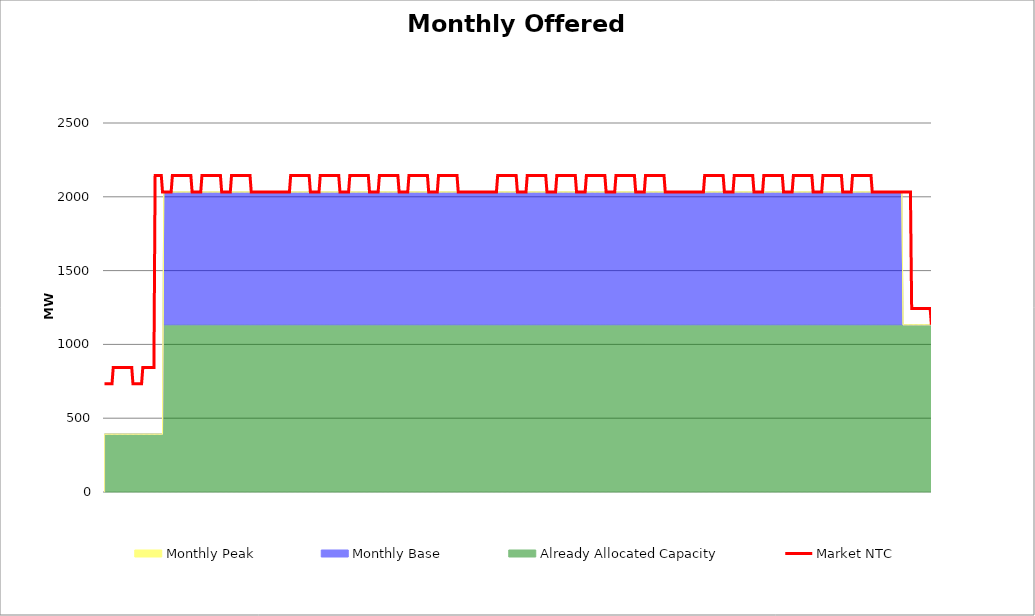
| Category | Market NTC |
|---|---|
| 0 | 733 |
| 1 | 733 |
| 2 | 733 |
| 3 | 733 |
| 4 | 733 |
| 5 | 733 |
| 6 | 733 |
| 7 | 844 |
| 8 | 844 |
| 9 | 844 |
| 10 | 844 |
| 11 | 844 |
| 12 | 844 |
| 13 | 844 |
| 14 | 844 |
| 15 | 844 |
| 16 | 844 |
| 17 | 844 |
| 18 | 844 |
| 19 | 844 |
| 20 | 844 |
| 21 | 844 |
| 22 | 844 |
| 23 | 733 |
| 24 | 733 |
| 25 | 733 |
| 26 | 733 |
| 27 | 733 |
| 28 | 733 |
| 29 | 733 |
| 30 | 733 |
| 31 | 844 |
| 32 | 844 |
| 33 | 844 |
| 34 | 844 |
| 35 | 844 |
| 36 | 844 |
| 37 | 844 |
| 38 | 844 |
| 39 | 844 |
| 40 | 844 |
| 41 | 2144 |
| 42 | 2144 |
| 43 | 2144 |
| 44 | 2144 |
| 45 | 2144 |
| 46 | 2144 |
| 47 | 2033 |
| 48 | 2033 |
| 49 | 2033 |
| 50 | 2033 |
| 51 | 2033 |
| 52 | 2033 |
| 53 | 2033 |
| 54 | 2033 |
| 55 | 2144 |
| 56 | 2144 |
| 57 | 2144 |
| 58 | 2144 |
| 59 | 2144 |
| 60 | 2144 |
| 61 | 2144 |
| 62 | 2144 |
| 63 | 2144 |
| 64 | 2144 |
| 65 | 2144 |
| 66 | 2144 |
| 67 | 2144 |
| 68 | 2144 |
| 69 | 2144 |
| 70 | 2144 |
| 71 | 2033 |
| 72 | 2033 |
| 73 | 2033 |
| 74 | 2033 |
| 75 | 2033 |
| 76 | 2033 |
| 77 | 2033 |
| 78 | 2033 |
| 79 | 2144 |
| 80 | 2144 |
| 81 | 2144 |
| 82 | 2144 |
| 83 | 2144 |
| 84 | 2144 |
| 85 | 2144 |
| 86 | 2144 |
| 87 | 2144 |
| 88 | 2144 |
| 89 | 2144 |
| 90 | 2144 |
| 91 | 2144 |
| 92 | 2144 |
| 93 | 2144 |
| 94 | 2144 |
| 95 | 2033 |
| 96 | 2033 |
| 97 | 2033 |
| 98 | 2033 |
| 99 | 2033 |
| 100 | 2033 |
| 101 | 2033 |
| 102 | 2033 |
| 103 | 2144 |
| 104 | 2144 |
| 105 | 2144 |
| 106 | 2144 |
| 107 | 2144 |
| 108 | 2144 |
| 109 | 2144 |
| 110 | 2144 |
| 111 | 2144 |
| 112 | 2144 |
| 113 | 2144 |
| 114 | 2144 |
| 115 | 2144 |
| 116 | 2144 |
| 117 | 2144 |
| 118 | 2144 |
| 119 | 2033 |
| 120 | 2033 |
| 121 | 2033 |
| 122 | 2033 |
| 123 | 2033 |
| 124 | 2033 |
| 125 | 2033 |
| 126 | 2033 |
| 127 | 2033 |
| 128 | 2033 |
| 129 | 2033 |
| 130 | 2033 |
| 131 | 2033 |
| 132 | 2033 |
| 133 | 2033 |
| 134 | 2033 |
| 135 | 2033 |
| 136 | 2033 |
| 137 | 2033 |
| 138 | 2033 |
| 139 | 2033 |
| 140 | 2033 |
| 141 | 2033 |
| 142 | 2033 |
| 143 | 2033 |
| 144 | 2033 |
| 145 | 2033 |
| 146 | 2033 |
| 147 | 2033 |
| 148 | 2033 |
| 149 | 2033 |
| 150 | 2033 |
| 151 | 2144 |
| 152 | 2144 |
| 153 | 2144 |
| 154 | 2144 |
| 155 | 2144 |
| 156 | 2144 |
| 157 | 2144 |
| 158 | 2144 |
| 159 | 2144 |
| 160 | 2144 |
| 161 | 2144 |
| 162 | 2144 |
| 163 | 2144 |
| 164 | 2144 |
| 165 | 2144 |
| 166 | 2144 |
| 167 | 2033 |
| 168 | 2033 |
| 169 | 2033 |
| 170 | 2033 |
| 171 | 2033 |
| 172 | 2033 |
| 173 | 2033 |
| 174 | 2033 |
| 175 | 2144 |
| 176 | 2144 |
| 177 | 2144 |
| 178 | 2144 |
| 179 | 2144 |
| 180 | 2144 |
| 181 | 2144 |
| 182 | 2144 |
| 183 | 2144 |
| 184 | 2144 |
| 185 | 2144 |
| 186 | 2144 |
| 187 | 2144 |
| 188 | 2144 |
| 189 | 2144 |
| 190 | 2144 |
| 191 | 2033 |
| 192 | 2033 |
| 193 | 2033 |
| 194 | 2033 |
| 195 | 2033 |
| 196 | 2033 |
| 197 | 2033 |
| 198 | 2033 |
| 199 | 2144 |
| 200 | 2144 |
| 201 | 2144 |
| 202 | 2144 |
| 203 | 2144 |
| 204 | 2144 |
| 205 | 2144 |
| 206 | 2144 |
| 207 | 2144 |
| 208 | 2144 |
| 209 | 2144 |
| 210 | 2144 |
| 211 | 2144 |
| 212 | 2144 |
| 213 | 2144 |
| 214 | 2144 |
| 215 | 2033 |
| 216 | 2033 |
| 217 | 2033 |
| 218 | 2033 |
| 219 | 2033 |
| 220 | 2033 |
| 221 | 2033 |
| 222 | 2033 |
| 223 | 2144 |
| 224 | 2144 |
| 225 | 2144 |
| 226 | 2144 |
| 227 | 2144 |
| 228 | 2144 |
| 229 | 2144 |
| 230 | 2144 |
| 231 | 2144 |
| 232 | 2144 |
| 233 | 2144 |
| 234 | 2144 |
| 235 | 2144 |
| 236 | 2144 |
| 237 | 2144 |
| 238 | 2144 |
| 239 | 2033 |
| 240 | 2033 |
| 241 | 2033 |
| 242 | 2033 |
| 243 | 2033 |
| 244 | 2033 |
| 245 | 2033 |
| 246 | 2033 |
| 247 | 2144 |
| 248 | 2144 |
| 249 | 2144 |
| 250 | 2144 |
| 251 | 2144 |
| 252 | 2144 |
| 253 | 2144 |
| 254 | 2144 |
| 255 | 2144 |
| 256 | 2144 |
| 257 | 2144 |
| 258 | 2144 |
| 259 | 2144 |
| 260 | 2144 |
| 261 | 2144 |
| 262 | 2144 |
| 263 | 2033 |
| 264 | 2033 |
| 265 | 2033 |
| 266 | 2033 |
| 267 | 2033 |
| 268 | 2033 |
| 269 | 2033 |
| 270 | 2033 |
| 271 | 2144 |
| 272 | 2144 |
| 273 | 2144 |
| 274 | 2144 |
| 275 | 2144 |
| 276 | 2144 |
| 277 | 2144 |
| 278 | 2144 |
| 279 | 2144 |
| 280 | 2144 |
| 281 | 2144 |
| 282 | 2144 |
| 283 | 2144 |
| 284 | 2144 |
| 285 | 2144 |
| 286 | 2144 |
| 287 | 2033 |
| 288 | 2033 |
| 289 | 2033 |
| 290 | 2033 |
| 291 | 2033 |
| 292 | 2033 |
| 293 | 2033 |
| 294 | 2033 |
| 295 | 2033 |
| 296 | 2033 |
| 297 | 2033 |
| 298 | 2033 |
| 299 | 2033 |
| 300 | 2033 |
| 301 | 2033 |
| 302 | 2033 |
| 303 | 2033 |
| 304 | 2033 |
| 305 | 2033 |
| 306 | 2033 |
| 307 | 2033 |
| 308 | 2033 |
| 309 | 2033 |
| 310 | 2033 |
| 311 | 2033 |
| 312 | 2033 |
| 313 | 2033 |
| 314 | 2033 |
| 315 | 2033 |
| 316 | 2033 |
| 317 | 2033 |
| 318 | 2033 |
| 319 | 2144 |
| 320 | 2144 |
| 321 | 2144 |
| 322 | 2144 |
| 323 | 2144 |
| 324 | 2144 |
| 325 | 2144 |
| 326 | 2144 |
| 327 | 2144 |
| 328 | 2144 |
| 329 | 2144 |
| 330 | 2144 |
| 331 | 2144 |
| 332 | 2144 |
| 333 | 2144 |
| 334 | 2144 |
| 335 | 2033 |
| 336 | 2033 |
| 337 | 2033 |
| 338 | 2033 |
| 339 | 2033 |
| 340 | 2033 |
| 341 | 2033 |
| 342 | 2033 |
| 343 | 2144 |
| 344 | 2144 |
| 345 | 2144 |
| 346 | 2144 |
| 347 | 2144 |
| 348 | 2144 |
| 349 | 2144 |
| 350 | 2144 |
| 351 | 2144 |
| 352 | 2144 |
| 353 | 2144 |
| 354 | 2144 |
| 355 | 2144 |
| 356 | 2144 |
| 357 | 2144 |
| 358 | 2144 |
| 359 | 2033 |
| 360 | 2033 |
| 361 | 2033 |
| 362 | 2033 |
| 363 | 2033 |
| 364 | 2033 |
| 365 | 2033 |
| 366 | 2033 |
| 367 | 2144 |
| 368 | 2144 |
| 369 | 2144 |
| 370 | 2144 |
| 371 | 2144 |
| 372 | 2144 |
| 373 | 2144 |
| 374 | 2144 |
| 375 | 2144 |
| 376 | 2144 |
| 377 | 2144 |
| 378 | 2144 |
| 379 | 2144 |
| 380 | 2144 |
| 381 | 2144 |
| 382 | 2144 |
| 383 | 2033 |
| 384 | 2033 |
| 385 | 2033 |
| 386 | 2033 |
| 387 | 2033 |
| 388 | 2033 |
| 389 | 2033 |
| 390 | 2033 |
| 391 | 2144 |
| 392 | 2144 |
| 393 | 2144 |
| 394 | 2144 |
| 395 | 2144 |
| 396 | 2144 |
| 397 | 2144 |
| 398 | 2144 |
| 399 | 2144 |
| 400 | 2144 |
| 401 | 2144 |
| 402 | 2144 |
| 403 | 2144 |
| 404 | 2144 |
| 405 | 2144 |
| 406 | 2144 |
| 407 | 2033 |
| 408 | 2033 |
| 409 | 2033 |
| 410 | 2033 |
| 411 | 2033 |
| 412 | 2033 |
| 413 | 2033 |
| 414 | 2033 |
| 415 | 2144 |
| 416 | 2144 |
| 417 | 2144 |
| 418 | 2144 |
| 419 | 2144 |
| 420 | 2144 |
| 421 | 2144 |
| 422 | 2144 |
| 423 | 2144 |
| 424 | 2144 |
| 425 | 2144 |
| 426 | 2144 |
| 427 | 2144 |
| 428 | 2144 |
| 429 | 2144 |
| 430 | 2144 |
| 431 | 2033 |
| 432 | 2033 |
| 433 | 2033 |
| 434 | 2033 |
| 435 | 2033 |
| 436 | 2033 |
| 437 | 2033 |
| 438 | 2033 |
| 439 | 2144 |
| 440 | 2144 |
| 441 | 2144 |
| 442 | 2144 |
| 443 | 2144 |
| 444 | 2144 |
| 445 | 2144 |
| 446 | 2144 |
| 447 | 2144 |
| 448 | 2144 |
| 449 | 2144 |
| 450 | 2144 |
| 451 | 2144 |
| 452 | 2144 |
| 453 | 2144 |
| 454 | 2144 |
| 455 | 2033 |
| 456 | 2033 |
| 457 | 2033 |
| 458 | 2033 |
| 459 | 2033 |
| 460 | 2033 |
| 461 | 2033 |
| 462 | 2033 |
| 463 | 2033 |
| 464 | 2033 |
| 465 | 2033 |
| 466 | 2033 |
| 467 | 2033 |
| 468 | 2033 |
| 469 | 2033 |
| 470 | 2033 |
| 471 | 2033 |
| 472 | 2033 |
| 473 | 2033 |
| 474 | 2033 |
| 475 | 2033 |
| 476 | 2033 |
| 477 | 2033 |
| 478 | 2033 |
| 479 | 2033 |
| 480 | 2033 |
| 481 | 2033 |
| 482 | 2033 |
| 483 | 2033 |
| 484 | 2033 |
| 485 | 2033 |
| 486 | 2033 |
| 487 | 2144 |
| 488 | 2144 |
| 489 | 2144 |
| 490 | 2144 |
| 491 | 2144 |
| 492 | 2144 |
| 493 | 2144 |
| 494 | 2144 |
| 495 | 2144 |
| 496 | 2144 |
| 497 | 2144 |
| 498 | 2144 |
| 499 | 2144 |
| 500 | 2144 |
| 501 | 2144 |
| 502 | 2144 |
| 503 | 2033 |
| 504 | 2033 |
| 505 | 2033 |
| 506 | 2033 |
| 507 | 2033 |
| 508 | 2033 |
| 509 | 2033 |
| 510 | 2033 |
| 511 | 2144 |
| 512 | 2144 |
| 513 | 2144 |
| 514 | 2144 |
| 515 | 2144 |
| 516 | 2144 |
| 517 | 2144 |
| 518 | 2144 |
| 519 | 2144 |
| 520 | 2144 |
| 521 | 2144 |
| 522 | 2144 |
| 523 | 2144 |
| 524 | 2144 |
| 525 | 2144 |
| 526 | 2144 |
| 527 | 2033 |
| 528 | 2033 |
| 529 | 2033 |
| 530 | 2033 |
| 531 | 2033 |
| 532 | 2033 |
| 533 | 2033 |
| 534 | 2033 |
| 535 | 2144 |
| 536 | 2144 |
| 537 | 2144 |
| 538 | 2144 |
| 539 | 2144 |
| 540 | 2144 |
| 541 | 2144 |
| 542 | 2144 |
| 543 | 2144 |
| 544 | 2144 |
| 545 | 2144 |
| 546 | 2144 |
| 547 | 2144 |
| 548 | 2144 |
| 549 | 2144 |
| 550 | 2144 |
| 551 | 2033 |
| 552 | 2033 |
| 553 | 2033 |
| 554 | 2033 |
| 555 | 2033 |
| 556 | 2033 |
| 557 | 2033 |
| 558 | 2033 |
| 559 | 2144 |
| 560 | 2144 |
| 561 | 2144 |
| 562 | 2144 |
| 563 | 2144 |
| 564 | 2144 |
| 565 | 2144 |
| 566 | 2144 |
| 567 | 2144 |
| 568 | 2144 |
| 569 | 2144 |
| 570 | 2144 |
| 571 | 2144 |
| 572 | 2144 |
| 573 | 2144 |
| 574 | 2144 |
| 575 | 2033 |
| 576 | 2033 |
| 577 | 2033 |
| 578 | 2033 |
| 579 | 2033 |
| 580 | 2033 |
| 581 | 2033 |
| 582 | 2033 |
| 583 | 2144 |
| 584 | 2144 |
| 585 | 2144 |
| 586 | 2144 |
| 587 | 2144 |
| 588 | 2144 |
| 589 | 2144 |
| 590 | 2144 |
| 591 | 2144 |
| 592 | 2144 |
| 593 | 2144 |
| 594 | 2144 |
| 595 | 2144 |
| 596 | 2144 |
| 597 | 2144 |
| 598 | 2144 |
| 599 | 2033 |
| 600 | 2033 |
| 601 | 2033 |
| 602 | 2033 |
| 603 | 2033 |
| 604 | 2033 |
| 605 | 2033 |
| 606 | 2033 |
| 607 | 2144 |
| 608 | 2144 |
| 609 | 2144 |
| 610 | 2144 |
| 611 | 2144 |
| 612 | 2144 |
| 613 | 2144 |
| 614 | 2144 |
| 615 | 2144 |
| 616 | 2144 |
| 617 | 2144 |
| 618 | 2144 |
| 619 | 2144 |
| 620 | 2144 |
| 621 | 2144 |
| 622 | 2144 |
| 623 | 2033 |
| 624 | 2033 |
| 625 | 2033 |
| 626 | 2033 |
| 627 | 2033 |
| 628 | 2033 |
| 629 | 2033 |
| 630 | 2033 |
| 631 | 2033 |
| 632 | 2033 |
| 633 | 2033 |
| 634 | 2033 |
| 635 | 2033 |
| 636 | 2033 |
| 637 | 2033 |
| 638 | 2033 |
| 639 | 2033 |
| 640 | 2033 |
| 641 | 2033 |
| 642 | 2033 |
| 643 | 2033 |
| 644 | 2033 |
| 645 | 2033 |
| 646 | 2033 |
| 647 | 2033 |
| 648 | 2033 |
| 649 | 2033 |
| 650 | 2033 |
| 651 | 2033 |
| 652 | 2033 |
| 653 | 2033 |
| 654 | 2033 |
| 655 | 1244 |
| 656 | 1244 |
| 657 | 1244 |
| 658 | 1244 |
| 659 | 1244 |
| 660 | 1244 |
| 661 | 1244 |
| 662 | 1244 |
| 663 | 1244 |
| 664 | 1244 |
| 665 | 1244 |
| 666 | 1244 |
| 667 | 1244 |
| 668 | 1244 |
| 669 | 1244 |
| 670 | 1244 |
| 671 | 1133 |